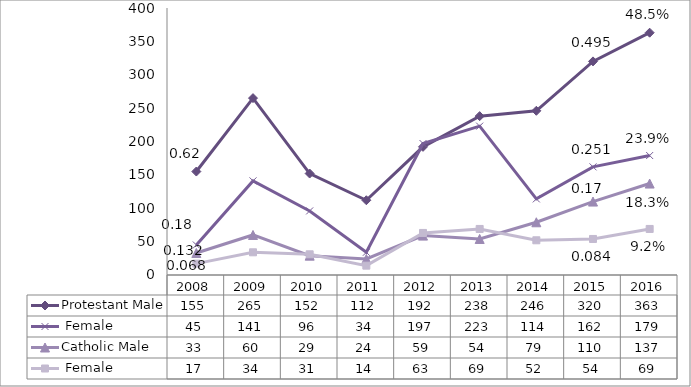
| Category | Protestant | Catholic |
|---|---|---|
| 2008.0 | 45 | 17 |
| 2009.0 | 141 | 34 |
| 2010.0 | 96 | 31 |
| 2011.0 | 34 | 14 |
| 2012.0 | 197 | 63 |
| 2013.0 | 223 | 69 |
| 2014.0 | 114 | 52 |
| 2015.0 | 162 | 54 |
| 2016.0 | 179 | 69 |